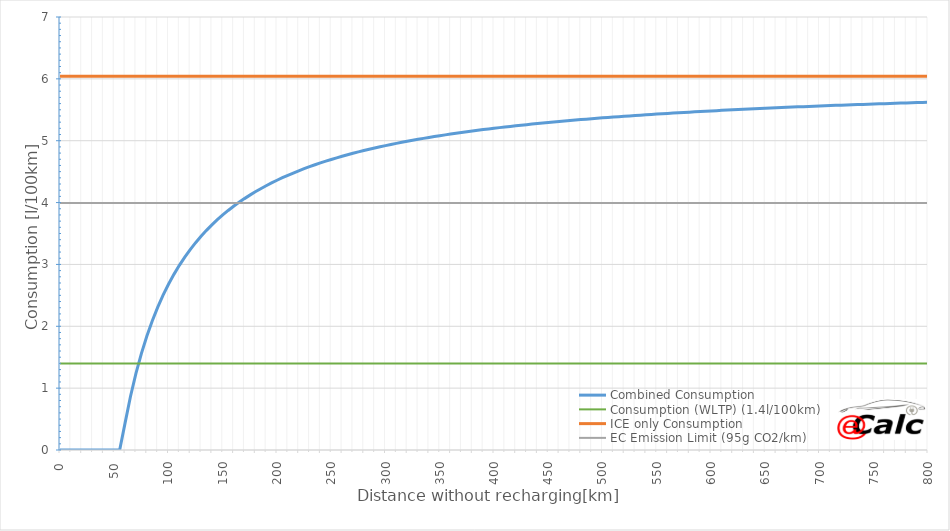
| Category | Combined Consumption | Consumption (WLTP) (1.4l/100km) | ICE only Consumption | EC Emission Limit (95g CO2/km) |
|---|---|---|---|---|
| 0.0 | 0 | 1.4 | 6.042 | 3.992 |
| 5.0 | 0 | 1.4 | 6.042 | 3.992 |
| 10.0 | 0 | 1.4 | 6.042 | 3.992 |
| 15.0 | 0 | 1.4 | 6.042 | 3.992 |
| 20.0 | 0 | 1.4 | 6.042 | 3.992 |
| 25.0 | 0 | 1.4 | 6.042 | 3.992 |
| 30.0 | 0 | 1.4 | 6.042 | 3.992 |
| 35.0 | 0 | 1.4 | 6.042 | 3.992 |
| 40.0 | 0 | 1.4 | 6.042 | 3.992 |
| 45.0 | 0 | 1.4 | 6.042 | 3.992 |
| 50.0 | 0 | 1.4 | 6.042 | 3.992 |
| 55.0 | 0 | 1.4 | 6.042 | 3.992 |
| 60.0 | 0.438 | 1.4 | 6.042 | 3.992 |
| 65.0 | 0.869 | 1.4 | 6.042 | 3.992 |
| 70.0 | 1.238 | 1.4 | 6.042 | 3.992 |
| 75.0 | 1.559 | 1.4 | 6.042 | 3.992 |
| 80.0 | 1.839 | 1.4 | 6.042 | 3.992 |
| 85.0 | 2.086 | 1.4 | 6.042 | 3.992 |
| 90.0 | 2.306 | 1.4 | 6.042 | 3.992 |
| 95.0 | 2.502 | 1.4 | 6.042 | 3.992 |
| 100.0 | 2.679 | 1.4 | 6.042 | 3.992 |
| 105.0 | 2.84 | 1.4 | 6.042 | 3.992 |
| 110.0 | 2.985 | 1.4 | 6.042 | 3.992 |
| 115.0 | 3.118 | 1.4 | 6.042 | 3.992 |
| 120.0 | 3.24 | 1.4 | 6.042 | 3.992 |
| 125.0 | 3.352 | 1.4 | 6.042 | 3.992 |
| 130.0 | 3.455 | 1.4 | 6.042 | 3.992 |
| 135.0 | 3.551 | 1.4 | 6.042 | 3.992 |
| 140.0 | 3.64 | 1.4 | 6.042 | 3.992 |
| 145.0 | 3.723 | 1.4 | 6.042 | 3.992 |
| 150.0 | 3.8 | 1.4 | 6.042 | 3.992 |
| 155.0 | 3.873 | 1.4 | 6.042 | 3.992 |
| 160.0 | 3.94 | 1.4 | 6.042 | 3.992 |
| 165.0 | 4.004 | 1.4 | 6.042 | 3.992 |
| 170.0 | 4.064 | 1.4 | 6.042 | 3.992 |
| 175.0 | 4.12 | 1.4 | 6.042 | 3.992 |
| 180.0 | 4.174 | 1.4 | 6.042 | 3.992 |
| 185.0 | 4.224 | 1.4 | 6.042 | 3.992 |
| 190.0 | 4.272 | 1.4 | 6.042 | 3.992 |
| 195.0 | 4.318 | 1.4 | 6.042 | 3.992 |
| 200.0 | 4.361 | 1.4 | 6.042 | 3.992 |
| 205.0 | 4.402 | 1.4 | 6.042 | 3.992 |
| 210.0 | 4.441 | 1.4 | 6.042 | 3.992 |
| 215.0 | 4.478 | 1.4 | 6.042 | 3.992 |
| 220.0 | 4.513 | 1.4 | 6.042 | 3.992 |
| 225.0 | 4.547 | 1.4 | 6.042 | 3.992 |
| 230.0 | 4.58 | 1.4 | 6.042 | 3.992 |
| 235.0 | 4.611 | 1.4 | 6.042 | 3.992 |
| 240.0 | 4.641 | 1.4 | 6.042 | 3.992 |
| 245.0 | 4.669 | 1.4 | 6.042 | 3.992 |
| 250.0 | 4.697 | 1.4 | 6.042 | 3.992 |
| 255.0 | 4.723 | 1.4 | 6.042 | 3.992 |
| 260.0 | 4.749 | 1.4 | 6.042 | 3.992 |
| 265.0 | 4.773 | 1.4 | 6.042 | 3.992 |
| 270.0 | 4.796 | 1.4 | 6.042 | 3.992 |
| 275.0 | 4.819 | 1.4 | 6.042 | 3.992 |
| 280.0 | 4.841 | 1.4 | 6.042 | 3.992 |
| 285.0 | 4.862 | 1.4 | 6.042 | 3.992 |
| 290.0 | 4.882 | 1.4 | 6.042 | 3.992 |
| 295.0 | 4.902 | 1.4 | 6.042 | 3.992 |
| 300.0 | 4.921 | 1.4 | 6.042 | 3.992 |
| 305.0 | 4.939 | 1.4 | 6.042 | 3.992 |
| 310.0 | 4.957 | 1.4 | 6.042 | 3.992 |
| 315.0 | 4.974 | 1.4 | 6.042 | 3.992 |
| 320.0 | 4.991 | 1.4 | 6.042 | 3.992 |
| 325.0 | 5.007 | 1.4 | 6.042 | 3.992 |
| 330.0 | 5.023 | 1.4 | 6.042 | 3.992 |
| 335.0 | 5.038 | 1.4 | 6.042 | 3.992 |
| 340.0 | 5.053 | 1.4 | 6.042 | 3.992 |
| 345.0 | 5.067 | 1.4 | 6.042 | 3.992 |
| 350.0 | 5.081 | 1.4 | 6.042 | 3.992 |
| 355.0 | 5.095 | 1.4 | 6.042 | 3.992 |
| 360.0 | 5.108 | 1.4 | 6.042 | 3.992 |
| 365.0 | 5.121 | 1.4 | 6.042 | 3.992 |
| 370.0 | 5.133 | 1.4 | 6.042 | 3.992 |
| 375.0 | 5.145 | 1.4 | 6.042 | 3.992 |
| 380.0 | 5.157 | 1.4 | 6.042 | 3.992 |
| 385.0 | 5.168 | 1.4 | 6.042 | 3.992 |
| 390.0 | 5.18 | 1.4 | 6.042 | 3.992 |
| 395.0 | 5.191 | 1.4 | 6.042 | 3.992 |
| 400.0 | 5.201 | 1.4 | 6.042 | 3.992 |
| 405.0 | 5.212 | 1.4 | 6.042 | 3.992 |
| 410.0 | 5.222 | 1.4 | 6.042 | 3.992 |
| 415.0 | 5.232 | 1.4 | 6.042 | 3.992 |
| 420.0 | 5.241 | 1.4 | 6.042 | 3.992 |
| 425.0 | 5.251 | 1.4 | 6.042 | 3.992 |
| 430.0 | 5.26 | 1.4 | 6.042 | 3.992 |
| 435.0 | 5.269 | 1.4 | 6.042 | 3.992 |
| 440.0 | 5.278 | 1.4 | 6.042 | 3.992 |
| 445.0 | 5.286 | 1.4 | 6.042 | 3.992 |
| 450.0 | 5.295 | 1.4 | 6.042 | 3.992 |
| 455.0 | 5.303 | 1.4 | 6.042 | 3.992 |
| 460.0 | 5.311 | 1.4 | 6.042 | 3.992 |
| 465.0 | 5.319 | 1.4 | 6.042 | 3.992 |
| 470.0 | 5.326 | 1.4 | 6.042 | 3.992 |
| 475.0 | 5.334 | 1.4 | 6.042 | 3.992 |
| 480.0 | 5.341 | 1.4 | 6.042 | 3.992 |
| 485.0 | 5.349 | 1.4 | 6.042 | 3.992 |
| 490.0 | 5.356 | 1.4 | 6.042 | 3.992 |
| 495.0 | 5.363 | 1.4 | 6.042 | 3.992 |
| 500.0 | 5.369 | 1.4 | 6.042 | 3.992 |
| 505.0 | 5.376 | 1.4 | 6.042 | 3.992 |
| 510.0 | 5.383 | 1.4 | 6.042 | 3.992 |
| 515.0 | 5.389 | 1.4 | 6.042 | 3.992 |
| 520.0 | 5.395 | 1.4 | 6.042 | 3.992 |
| 525.0 | 5.401 | 1.4 | 6.042 | 3.992 |
| 530.0 | 5.407 | 1.4 | 6.042 | 3.992 |
| 535.0 | 5.413 | 1.4 | 6.042 | 3.992 |
| 540.0 | 5.419 | 1.4 | 6.042 | 3.992 |
| 545.0 | 5.425 | 1.4 | 6.042 | 3.992 |
| 550.0 | 5.43 | 1.4 | 6.042 | 3.992 |
| 555.0 | 5.436 | 1.4 | 6.042 | 3.992 |
| 560.0 | 5.441 | 1.4 | 6.042 | 3.992 |
| 565.0 | 5.447 | 1.4 | 6.042 | 3.992 |
| 570.0 | 5.452 | 1.4 | 6.042 | 3.992 |
| 575.0 | 5.457 | 1.4 | 6.042 | 3.992 |
| 580.0 | 5.462 | 1.4 | 6.042 | 3.992 |
| 585.0 | 5.467 | 1.4 | 6.042 | 3.992 |
| 590.0 | 5.472 | 1.4 | 6.042 | 3.992 |
| 595.0 | 5.477 | 1.4 | 6.042 | 3.992 |
| 600.0 | 5.481 | 1.4 | 6.042 | 3.992 |
| 605.0 | 5.486 | 1.4 | 6.042 | 3.992 |
| 610.0 | 5.491 | 1.4 | 6.042 | 3.992 |
| 615.0 | 5.495 | 1.4 | 6.042 | 3.992 |
| 620.0 | 5.5 | 1.4 | 6.042 | 3.992 |
| 625.0 | 5.504 | 1.4 | 6.042 | 3.992 |
| 630.0 | 5.508 | 1.4 | 6.042 | 3.992 |
| 635.0 | 5.512 | 1.4 | 6.042 | 3.992 |
| 640.0 | 5.516 | 1.4 | 6.042 | 3.992 |
| 645.0 | 5.521 | 1.4 | 6.042 | 3.992 |
| 650.0 | 5.525 | 1.4 | 6.042 | 3.992 |
| 655.0 | 5.528 | 1.4 | 6.042 | 3.992 |
| 660.0 | 5.532 | 1.4 | 6.042 | 3.992 |
| 665.0 | 5.536 | 1.4 | 6.042 | 3.992 |
| 670.0 | 5.54 | 1.4 | 6.042 | 3.992 |
| 675.0 | 5.544 | 1.4 | 6.042 | 3.992 |
| 680.0 | 5.547 | 1.4 | 6.042 | 3.992 |
| 685.0 | 5.551 | 1.4 | 6.042 | 3.992 |
| 690.0 | 5.555 | 1.4 | 6.042 | 3.992 |
| 695.0 | 5.558 | 1.4 | 6.042 | 3.992 |
| 700.0 | 5.561 | 1.4 | 6.042 | 3.992 |
| 705.0 | 5.565 | 1.4 | 6.042 | 3.992 |
| 710.0 | 5.568 | 1.4 | 6.042 | 3.992 |
| 715.0 | 5.572 | 1.4 | 6.042 | 3.992 |
| 720.0 | 5.575 | 1.4 | 6.042 | 3.992 |
| 725.0 | 5.578 | 1.4 | 6.042 | 3.992 |
| 730.0 | 5.581 | 1.4 | 6.042 | 3.992 |
| 735.0 | 5.584 | 1.4 | 6.042 | 3.992 |
| 740.0 | 5.587 | 1.4 | 6.042 | 3.992 |
| 745.0 | 5.59 | 1.4 | 6.042 | 3.992 |
| 750.0 | 5.594 | 1.4 | 6.042 | 3.992 |
| 755.0 | 5.596 | 1.4 | 6.042 | 3.992 |
| 760.0 | 5.599 | 1.4 | 6.042 | 3.992 |
| 765.0 | 5.602 | 1.4 | 6.042 | 3.992 |
| 770.0 | 5.605 | 1.4 | 6.042 | 3.992 |
| 775.0 | 5.608 | 1.4 | 6.042 | 3.992 |
| 780.0 | 5.611 | 1.4 | 6.042 | 3.992 |
| 785.0 | 5.613 | 1.4 | 6.042 | 3.992 |
| 790.0 | 5.616 | 1.4 | 6.042 | 3.992 |
| 795.0 | 5.619 | 1.4 | 6.042 | 3.992 |
| 800.0 | 5.622 | 1.4 | 6.042 | 3.992 |